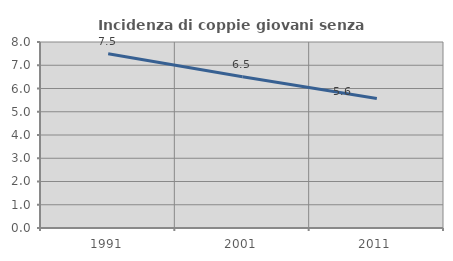
| Category | Incidenza di coppie giovani senza figli |
|---|---|
| 1991.0 | 7.494 |
| 2001.0 | 6.508 |
| 2011.0 | 5.573 |